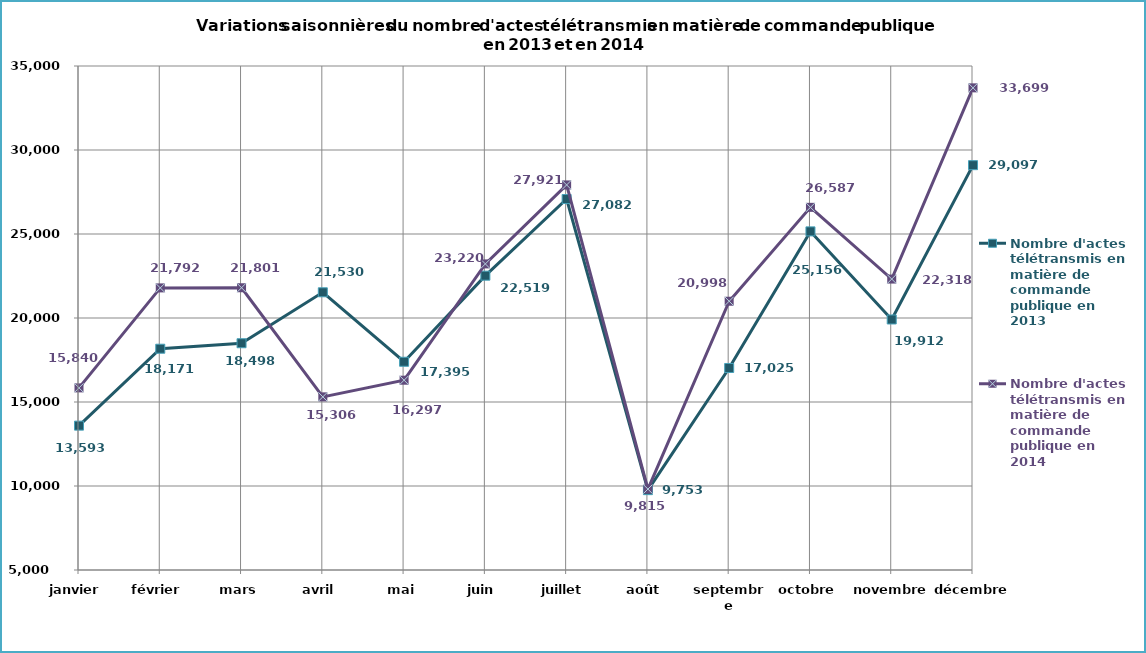
| Category | Nombre d'actes télétransmis en matière de commande publique en 2013 | Nombre d'actes télétransmis en matière de commande publique en 2014 |
|---|---|---|
| janvier | 13593 | 15840 |
| février | 18171 | 21792 |
| mars | 18498 | 21801 |
| avril | 21530 | 15306 |
| mai | 17395 | 16297 |
| juin | 22519 | 23220 |
| juillet | 27082 | 27921 |
| août | 9753 | 9815 |
| septembre | 17025 | 20998 |
| octobre | 25156 | 26587 |
| novembre | 19912 | 22318 |
| décembre | 29097 | 33699 |